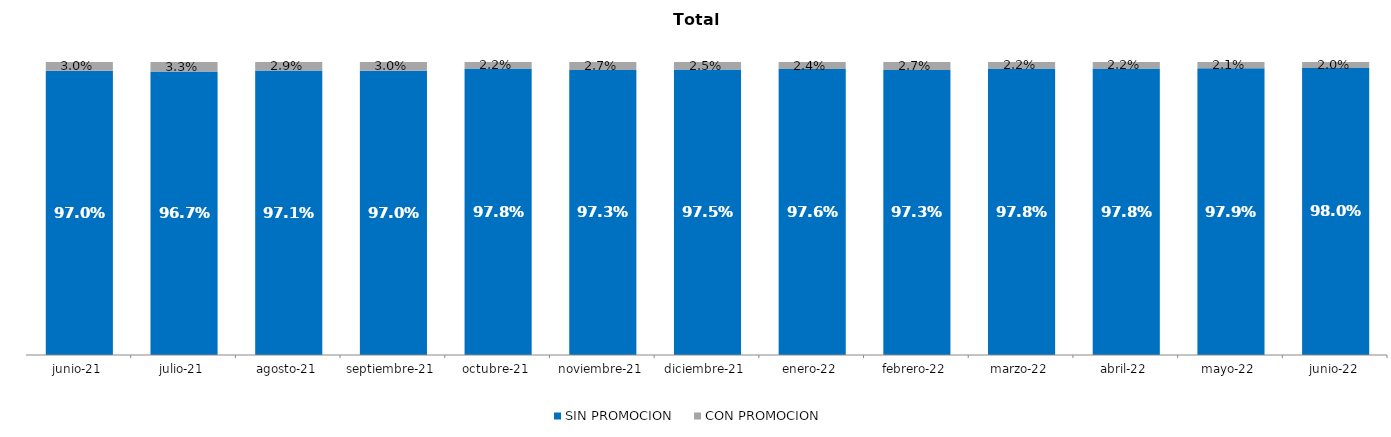
| Category | SIN PROMOCION   | CON PROMOCION   |
|---|---|---|
| 2021-06-01 | 0.97 | 0.03 |
| 2021-07-01 | 0.967 | 0.033 |
| 2021-08-01 | 0.971 | 0.029 |
| 2021-09-01 | 0.97 | 0.03 |
| 2021-10-01 | 0.978 | 0.022 |
| 2021-11-01 | 0.973 | 0.027 |
| 2021-12-01 | 0.975 | 0.025 |
| 2022-01-01 | 0.976 | 0.024 |
| 2022-02-01 | 0.973 | 0.027 |
| 2022-03-01 | 0.978 | 0.022 |
| 2022-04-01 | 0.978 | 0.022 |
| 2022-05-01 | 0.979 | 0.021 |
| 2022-06-01 | 0.98 | 0.02 |